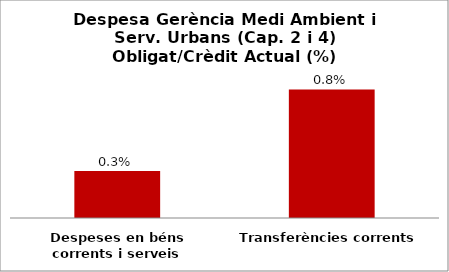
| Category | Series 0 |
|---|---|
| Despeses en béns corrents i serveis | 0.003 |
| Transferències corrents | 0.008 |